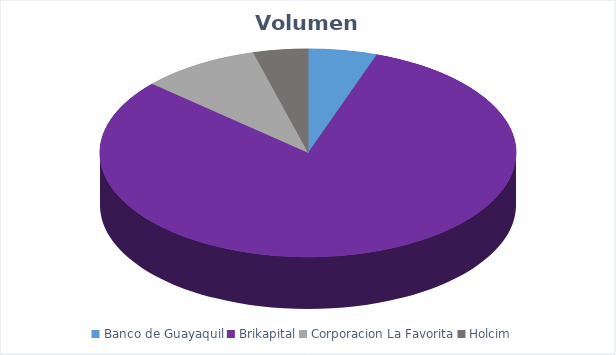
| Category | VOLUMEN ($USD) |
|---|---|
| Banco de Guayaquil | 7245.9 |
| Brikapital | 110000 |
| Corporacion La Favorita | 12487.64 |
| Holcim | 5740 |